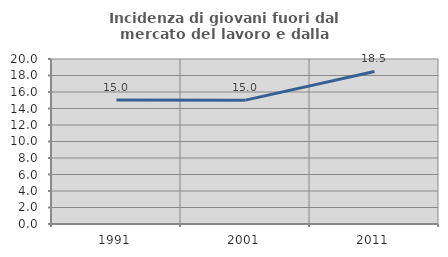
| Category | Incidenza di giovani fuori dal mercato del lavoro e dalla formazione  |
|---|---|
| 1991.0 | 15.018 |
| 2001.0 | 15.012 |
| 2011.0 | 18.495 |